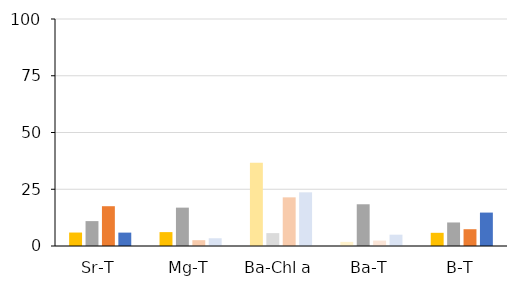
| Category | FO | IOM | ICE | GOM |
|---|---|---|---|---|
| Sr-T | 5.929 | 10.964 | 17.528 | 5.899 |
| Mg-T | 6.116 | 16.899 | 2.565 | 3.412 |
| Ba-Chl a | 36.624 | 5.671 | 21.432 | 23.645 |
| Ba-T | 1.812 | 18.384 | 2.382 | 4.981 |
| B-T | 5.81 | 10.364 | 7.39 | 14.722 |